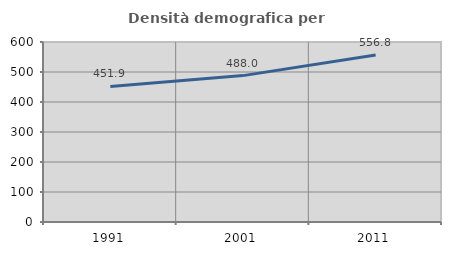
| Category | Densità demografica |
|---|---|
| 1991.0 | 451.872 |
| 2001.0 | 487.966 |
| 2011.0 | 556.776 |